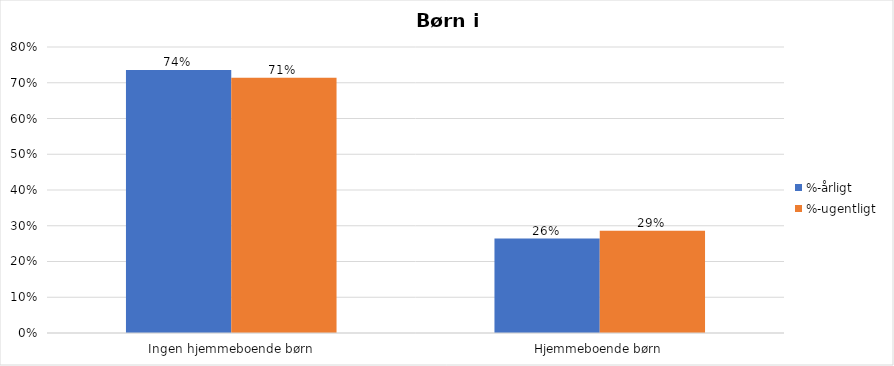
| Category | %-årligt | %-ugentligt |
|---|---|---|
| Ingen hjemmeboende børn | 0.736 | 0.714 |
| Hjemmeboende børn | 0.264 | 0.286 |